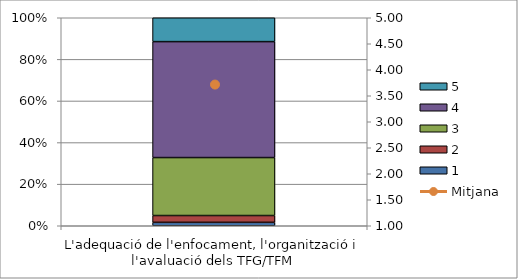
| Category | 1 | 2 | 3 | 4 | 5 |
|---|---|---|---|---|---|
| L'adequació de l'enfocament, l'organització i l'avaluació dels TFG/TFM | 1 | 2 | 17 | 34 | 7 |